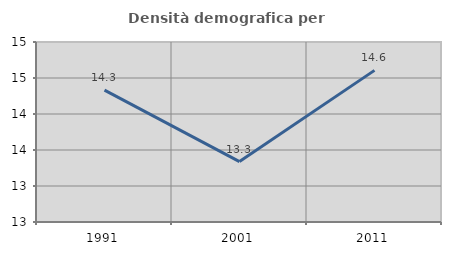
| Category | Densità demografica |
|---|---|
| 1991.0 | 14.333 |
| 2001.0 | 13.339 |
| 2011.0 | 14.606 |